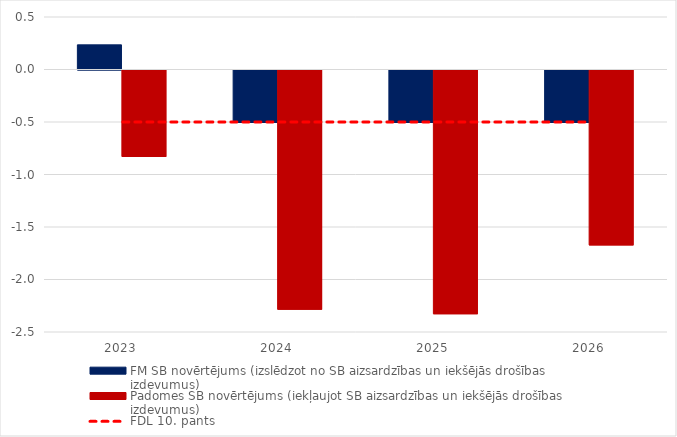
| Category | FM SB novērtējums (izslēdzot no SB aizsardzības un iekšējās drošības izdevumus)  | Padomes SB novērtējums (iekļaujot SB aizsardzības un iekšējās drošības izdevumus)  |
|---|---|---|
| 2023.0 | 0.235 | -0.823 |
| 2024.0 | -0.5 | -2.279 |
| 2025.0 | -0.5 | -2.322 |
| 2026.0 | -0.5 | -1.666 |